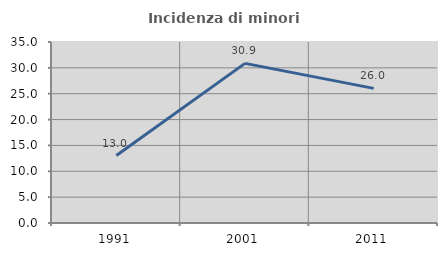
| Category | Incidenza di minori stranieri |
|---|---|
| 1991.0 | 13.043 |
| 2001.0 | 30.871 |
| 2011.0 | 26.037 |